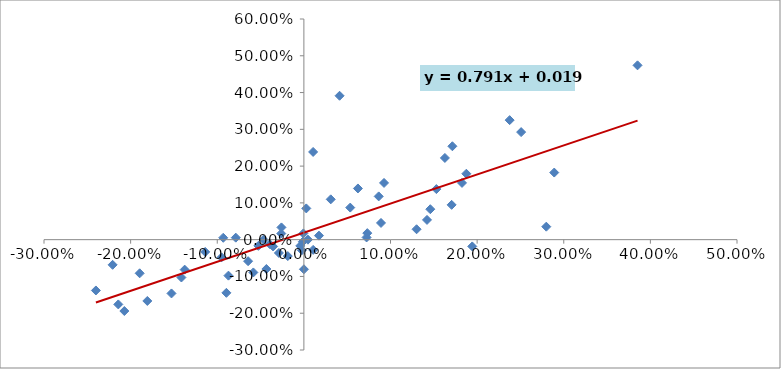
| Category | Series 0 |
|---|---|
| 0.25080046106557363 | 0.292 |
| 0.2890311020094716 | 0.182 |
| 0.18254031297164186 | 0.154 |
| -0.09499899240948484 | -0.048 |
| -0.04327253159154576 | -0.08 |
| -0.18072499466630465 | -0.167 |
| 0.16280391089226098 | 0.222 |
| 0.07237672543670337 | 0.006 |
| -0.028838304254551694 | -0.036 |
| 0.23753763146576978 | 0.325 |
| 0.18753652950003952 | 0.179 |
| 0.3851709964483818 | 0.474 |
| 0.09253550747601635 | 0.154 |
| -0.05832871871951073 | -0.089 |
| -0.13762332801284383 | -0.082 |
| 0.17057225427269485 | 0.095 |
| -0.05252061989126011 | -0.017 |
| -0.11391849162665424 | -0.033 |
| 5.506911173513984e-05 | -0.08 |
| 0.1529295154185022 | 0.138 |
| 0.01741398085703927 | 0.011 |
| -0.08707245397102581 | -0.098 |
| -0.04661901578649663 | 0 |
| -0.08943712109771096 | -0.145 |
| -0.21420194050538444 | -0.176 |
| -0.2207899894467058 | -0.068 |
| 0.010660733288188062 | 0.239 |
| -0.20725170380580438 | -0.194 |
| -0.035498671818401495 | -0.019 |
| 0.1300951427140713 | 0.028 |
| 0.19439028713222273 | -0.018 |
| -0.15284733815618634 | -0.146 |
| -0.24009196409021238 | -0.138 |
| -0.09309897709263792 | 0.005 |
| 0.00279595856897763 | 0.085 |
| -0.03931943476332311 | -0.012 |
| -0.1895386036080603 | -0.091 |
| 0.14214210140799222 | 0.054 |
| 0.14593650906758815 | 0.083 |
| 0.2798557348506048 | 0.035 |
| 0.08903410747254892 | 0.045 |
| 0.04120100827589268 | 0.391 |
| 0.17143714114319986 | 0.254 |
| 0.06240169720911526 | 0.139 |
| 0.010707522809433767 | -0.028 |
| -0.14136803379206975 | -0.103 |
| -0.018547171308418653 | -0.045 |
| -0.025890817955817824 | 0.033 |
| 0.031019171715495064 | 0.11 |
| 0.00468897788331879 | 0 |
| 0.0863913147984936 | 0.118 |
| -0.06440252963843873 | -0.059 |
| -0.0005912029008355857 | 0.017 |
| -0.026087470915329036 | 0.017 |
| -0.07861756190399072 | 0.005 |
| -0.0012305528698250967 | -0.006 |
| -0.004158232861040223 | -0.017 |
| -0.002297682433775927 | -0.029 |
| 0.07323014238579262 | 0.018 |
| 0.05352205669954202 | 0.087 |